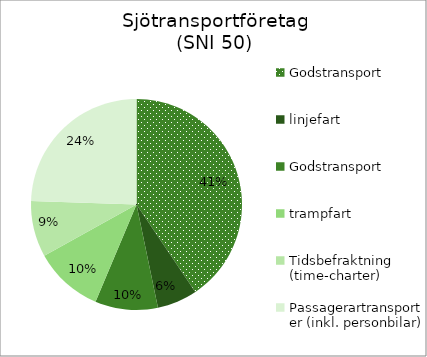
| Category | Godstransport, linjefart Godstransport, trampfart Tidsbefraktning (time-charter) Passagerartransporter (inkl. personbilar) Personaluthyrning för drift och bemanning av andras fartyg Övrigt |
|---|---|
| 0 | 13276.1 |
| 1 | 2013.51 |
| 2 | 3143.687 |
| 3 | 3461.17 |
| 4 | 2807.495 |
| 5 | 8011.471 |